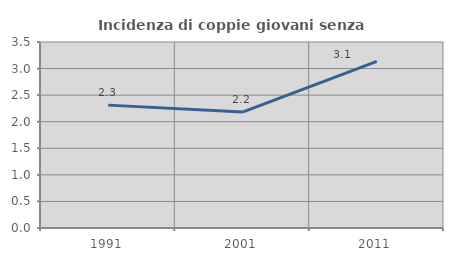
| Category | Incidenza di coppie giovani senza figli |
|---|---|
| 1991.0 | 2.312 |
| 2001.0 | 2.181 |
| 2011.0 | 3.135 |